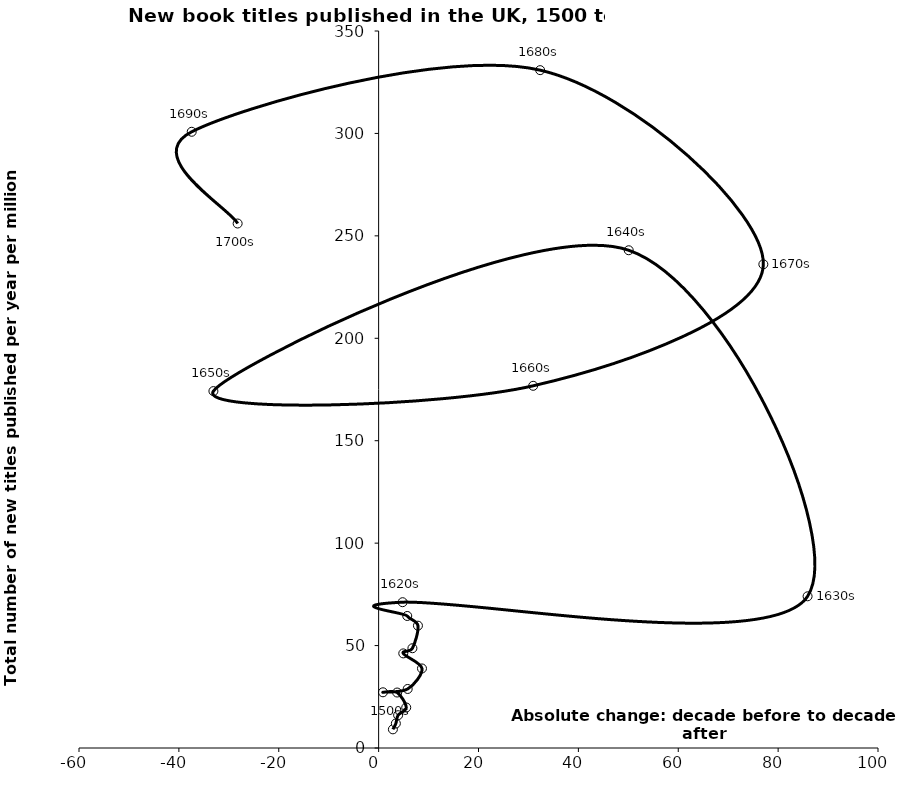
| Category | Series 0 |
|---|---|
| 2.8593682485516823 | 9.114 |
| 3.451525861902083 | 11.973 |
| 3.9029824254037964 | 16.017 |
| 5.530191463458202 | 19.779 |
| 3.7076349793134824 | 27.077 |
| 0.8685803371578729 | 27.195 |
| 5.817163253189891 | 28.815 |
| 8.681691345696926 | 38.829 |
| 4.936506599403568 | 46.178 |
| 6.76753564042118 | 48.702 |
| 7.873496820433811 | 59.713 |
| 5.730284567653936 | 64.449 |
| 4.801614751010305 | 71.174 |
| 85.89963912846056 | 74.052 |
| 50.081892414600006 | 242.973 |
| -33.0832021756101 | 174.216 |
| 30.948760044209877 | 176.807 |
| 77.04017059433855 | 236.114 |
| 32.34625968864188 | 330.887 |
| -37.42934582505157 | 300.806 |
| -28.231930921603464 | 256.028 |